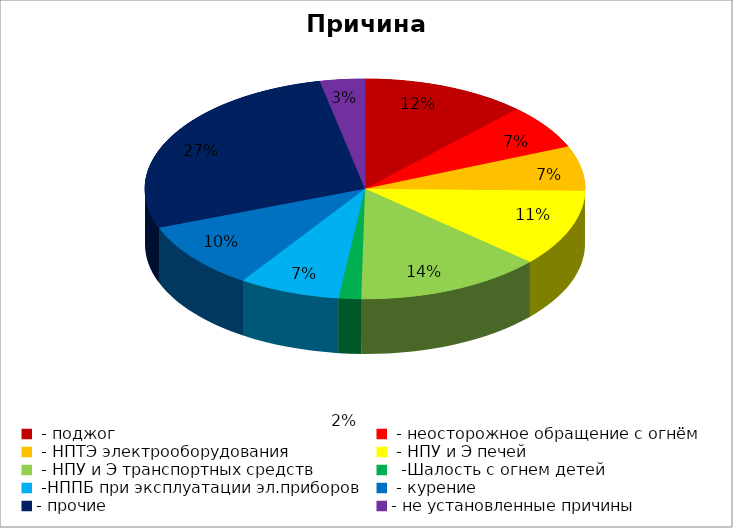
| Category | Причина пожара |
|---|---|
|  - поджог | 44 |
|  - неосторожное обращение с огнём | 24 |
|  - НПТЭ электрооборудования | 24 |
|  - НПУ и Э печей | 41 |
|  - НПУ и Э транспортных средств | 50 |
|   -Шалость с огнем детей | 6 |
|  -НППБ при эксплуатации эл.приборов | 27 |
|  - курение | 36 |
| - прочие | 100 |
| - не установленные причины | 12 |